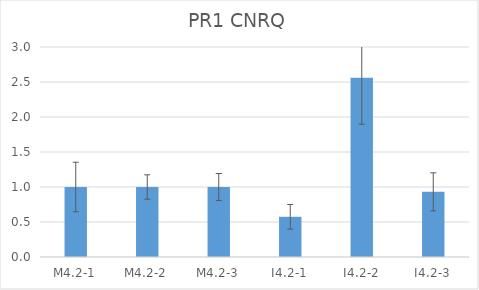
| Category | PR1 CNRQ |
|---|---|
| M4.2-1 | 1 |
| M4.2-2 | 1 |
| M4.2-3 | 1 |
| I4.2-1 | 0.574 |
| I4.2-2 | 2.56 |
| I4.2-3 | 0.931 |